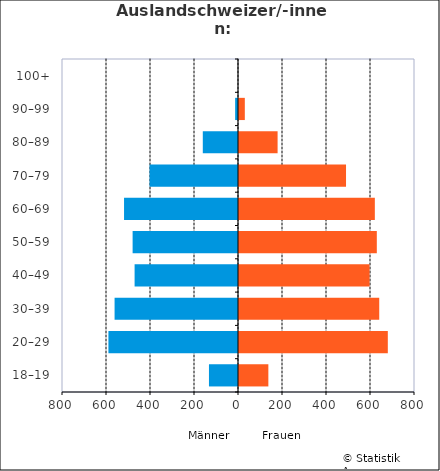
| Category | Männer | Frauen |
|---|---|---|
| 18–19 | -132 | 138 |
| 20–29 | -589 | 681 |
| 30–39 | -561 | 642 |
| 40–49 | -470 | 598 |
| 50–59 | -479 | 631 |
| 60–69 | -518 | 622 |
| 70–79 | -402 | 491 |
| 80–89 | -160 | 180 |
| 90–99 | -13 | 31 |
| 100+ | 0 | 0 |